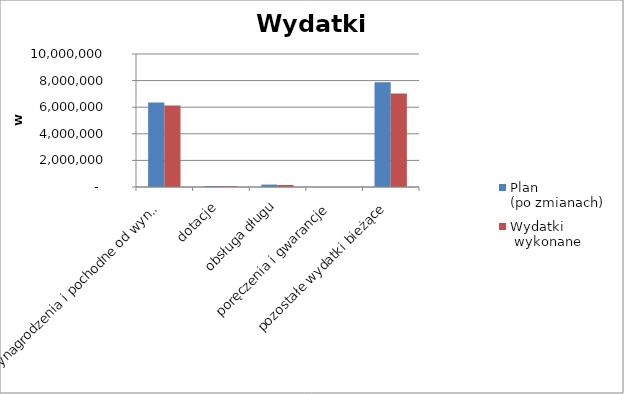
| Category | Plan 
(po zmianach) | Wydatki
 wykonane |
|---|---|---|
| wynagrodzenia i pochodne od wynagrodzeń | 6362184.75 | 6121185.83 |
| dotacje | 69646 | 56618.2 |
| obsługa długu | 181907 | 152016.65 |
| poręczenia i gwarancje | 0 | 0 |
| pozostałe wydatki bieżące | 7868284.85 | 7039431.39 |